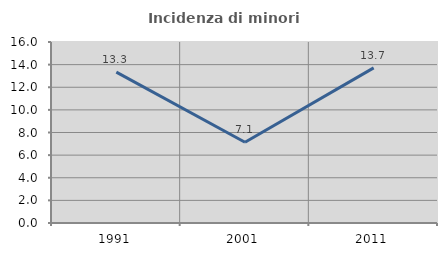
| Category | Incidenza di minori stranieri |
|---|---|
| 1991.0 | 13.333 |
| 2001.0 | 7.143 |
| 2011.0 | 13.717 |